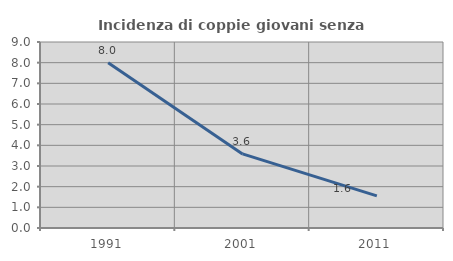
| Category | Incidenza di coppie giovani senza figli |
|---|---|
| 1991.0 | 8 |
| 2001.0 | 3.586 |
| 2011.0 | 1.556 |